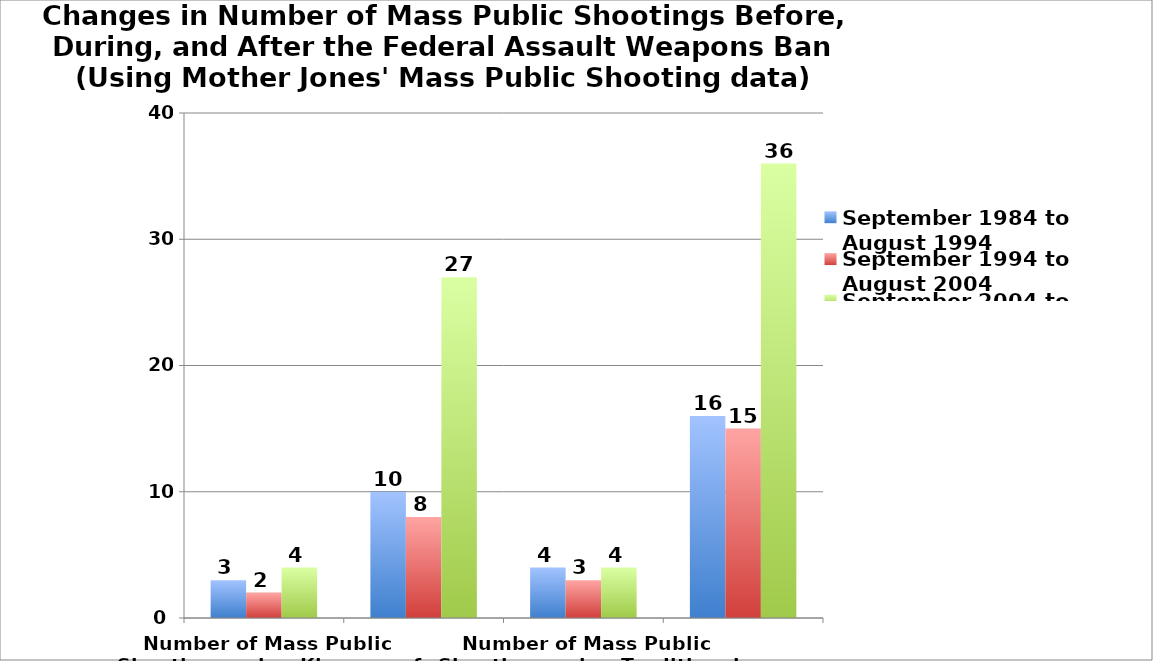
| Category | September 1984 to August 1994 | September 1994 to August 2004 | September 2004 to August 2014 |
|---|---|---|---|
| Number of Mass Public Shootings using Klaveras of 6 or more killed | 3 | 2 | 4 |
|  | 10 | 8 | 27 |
| Number of Mass Public Shootings using Traditional FBI Definition of 4 or more killed | 4 | 3 | 4 |
|  | 16 | 15 | 36 |